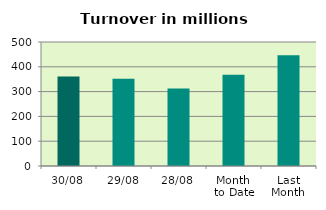
| Category | Series 0 |
|---|---|
| 30/08 | 360.432 |
| 29/08 | 351.509 |
| 28/08 | 312.142 |
| Month 
to Date | 368.333 |
| Last
Month | 446.279 |